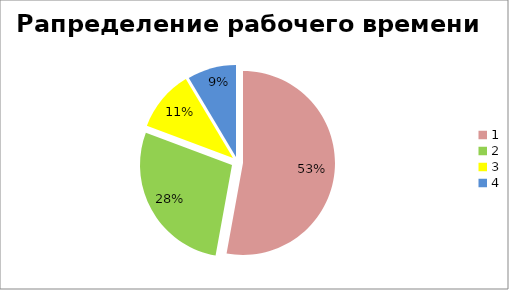
| Category | Series 0 |
|---|---|
| 0 | 0.257 |
| 1 | 0.135 |
| 2 | 0.052 |
| 3 | 0.042 |